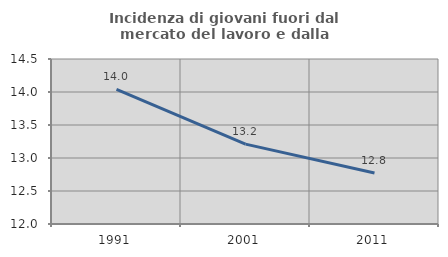
| Category | Incidenza di giovani fuori dal mercato del lavoro e dalla formazione  |
|---|---|
| 1991.0 | 14.04 |
| 2001.0 | 13.21 |
| 2011.0 | 12.774 |